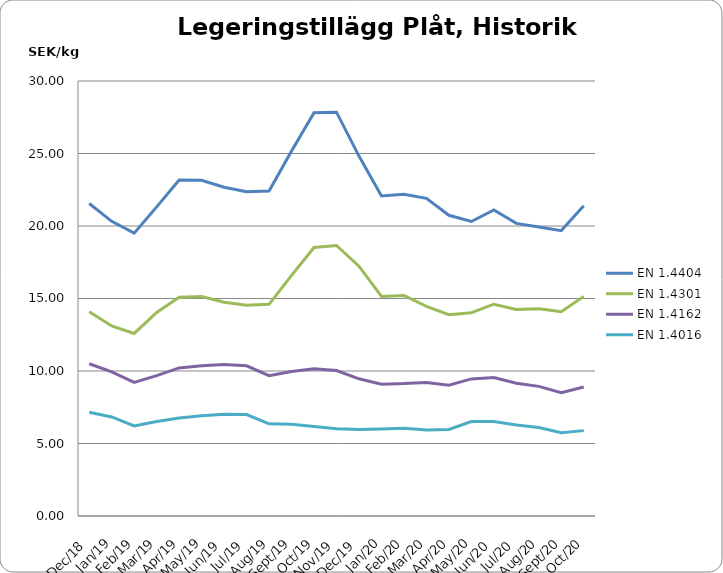
| Category | EN 1.4404 | EN 1.4301 | EN 1.4162  | EN 1.4016 |
|---|---|---|---|---|
| 2018-12-01 | 21.55 | 14.09 | 10.5 | 7.15 |
| 2019-01-01 | 20.32 | 13.11 | 9.94 | 6.83 |
| 2019-02-01 | 19.51 | 12.59 | 9.21 | 6.21 |
| 2019-03-01 | 21.32 | 14.04 | 9.68 | 6.52 |
| 2019-04-01 | 23.17 | 15.09 | 10.21 | 6.76 |
| 2019-05-01 | 23.15 | 15.14 | 10.36 | 6.91 |
| 2019-06-01 | 22.67 | 14.74 | 10.45 | 7.02 |
| 2019-07-01 | 22.36 | 14.54 | 10.36 | 7 |
| 2019-08-01 | 22.42 | 14.6 | 9.68 | 6.36 |
| 2019-09-01 | 25.17 | 16.6 | 9.97 | 6.33 |
| 2019-10-01 | 27.81 | 18.52 | 10.16 | 6.18 |
| 2019-11-01 | 27.85 | 18.66 | 10.03 | 6.01 |
| 2019-12-01 | 24.82 | 17.23 | 9.46 | 5.97 |
| 2020-01-01 | 22.07 | 15.14 | 9.09 | 6 |
| 2020-02-01 | 22.19 | 15.21 | 9.13 | 6.05 |
| 2020-03-01 | 21.911 | 14.462 | 9.207 | 5.938 |
| 2020-04-01 | 20.74 | 13.88 | 9.02 | 5.97 |
| 2020-05-01 | 20.311 | 14.022 | 9.455 | 6.515 |
| 2020-06-01 | 21.105 | 14.607 | 9.554 | 6.524 |
| 2020-07-01 | 20.18 | 14.24 | 9.15 | 6.27 |
| 2020-08-01 | 19.932 | 14.286 | 8.939 | 6.099 |
| 2020-09-01 | 19.682 | 14.092 | 8.509 | 5.737 |
| 2020-10-01 | 21.4 | 15.147 | 8.892 | 5.888 |